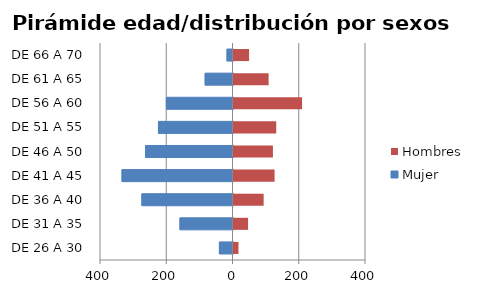
| Category | Mujer | Hombres |
|---|---|---|
| DE 26 A 30 | -41 | 15 |
| DE 31 A 35 | -160 | 44 |
| DE 36 A 40 | -275 | 91 |
| DE 41 A 45 | -335 | 124 |
| DE 46 A 50 | -264 | 119 |
| DE 51 A 55 | -225 | 129 |
| DE 56 A 60 | -201 | 207 |
| DE 61 A 65 | -84 | 106 |
| DE 66 A 70 | -18 | 47 |